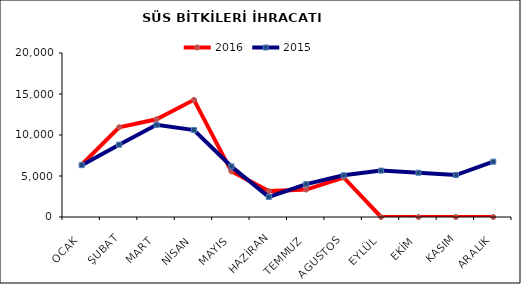
| Category | 2016 | 2015 |
|---|---|---|
| OCAK | 6380.197 | 6323.249 |
| ŞUBAT | 10943.895 | 8819.949 |
| MART | 11918.692 | 11241.368 |
| NİSAN | 14289.864 | 10605.655 |
| MAYIS | 5571.91 | 6164.764 |
| HAZİRAN | 3156.903 | 2449.981 |
| TEMMUZ | 3344.216 | 4008.56 |
| AGUSTOS | 4817.886 | 5086.787 |
| EYLÜL | 0 | 5655.74 |
| EKİM | 0 | 5397.69 |
| KASIM | 0 | 5119.454 |
| ARALIK | 0 | 6748.149 |